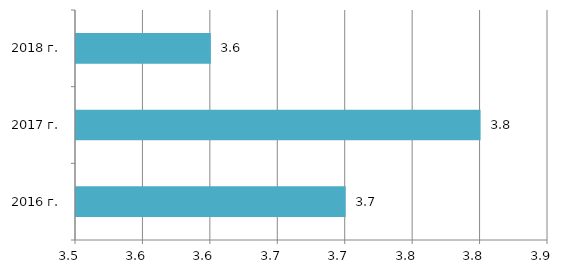
| Category | Series 0 |
|---|---|
| 2016 г. | 3.7 |
| 2017 г. | 3.8 |
| 2018 г. | 3.6 |